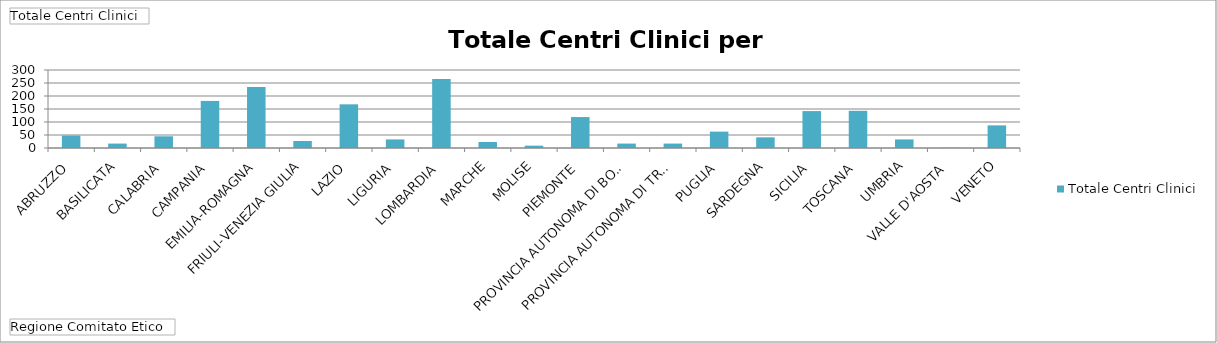
| Category | Totale |
|---|---|
| ABRUZZO | 48 |
| BASILICATA | 17 |
| CALABRIA | 45 |
| CAMPANIA | 181 |
| EMILIA-ROMAGNA | 235 |
| FRIULI-VENEZIA GIULIA | 27 |
| LAZIO | 168 |
| LIGURIA | 33 |
| LOMBARDIA | 265 |
| MARCHE | 23 |
| MOLISE | 9 |
| PIEMONTE | 119 |
| PROVINCIA AUTONOMA DI BOLZANO | 17 |
| PROVINCIA AUTONOMA DI TRENTO | 17 |
| PUGLIA | 63 |
| SARDEGNA | 41 |
| SICILIA | 142 |
| TOSCANA | 143 |
| UMBRIA | 33 |
| VALLE D'AOSTA | 1 |
| VENETO | 87 |